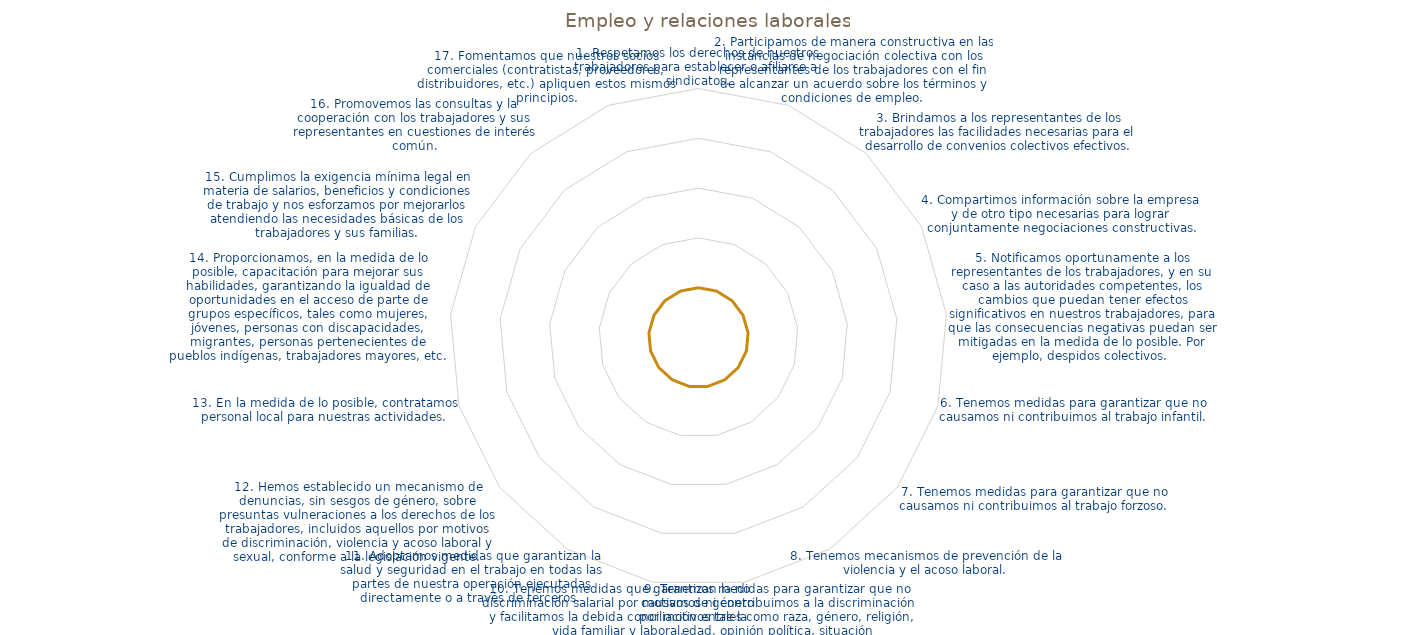
| Category | Series 0 |
|---|---|
| 1. Respetamos los derechos de nuestros trabajadores para establecer o afiliarse a sindicatos. | 1 |
| 2. Participamos de manera constructiva en las instancias de negociación colectiva con los representantes de los trabajadores con el fin de alcanzar un acuerdo sobre los términos y condiciones de empleo.  | 1 |
| 3. Brindamos a los representantes de los trabajadores las facilidades necesarias para el desarrollo de convenios colectivos efectivos. | 1 |
| 4. Compartimos información sobre la empresa y de otro tipo necesarias para lograr conjuntamente negociaciones constructivas. | 1 |
| 5. Notificamos oportunamente a los representantes de los trabajadores, y en su caso a las autoridades competentes, los cambios que puedan tener efectos significativos en nuestros trabajadores, para que las consecuencias negativas puedan ser mitigadas en la | 1 |
| 6. Tenemos medidas para garantizar que no causamos ni contribuimos al trabajo infantil. | 1 |
| 7. Tenemos medidas para garantizar que no causamos ni contribuimos al trabajo forzoso. | 1 |
| 8. Tenemos mecanismos de prevención de la violencia y el acoso laboral. | 1 |
| 9. Tenemos medidas para garantizar que no causamos ni contribuimos a la discriminación por motivos tales como raza, género, religión, edad, opinión política, situación socioeconómica, orientación sexual, identidad de género, entre otros. | 1 |
| 10. Tenemos medidas que garantizan la no discriminación salarial por motivos de género y facilitamos la debida conciliación entre la vida familiar y laboral. | 1 |
| 11. Adoptamos medidas que garantizan la salud y seguridad en el trabajo en todas las partes de nuestra operación ejecutadas directamente o a través de terceros.  | 1 |
| 12. Hemos establecido un mecanismo de denuncias, sin sesgos de género, sobre presuntas vulneraciones a los derechos de los trabajadores, incluidos aquellos por motivos de discriminación, violencia y acoso laboral y sexual, conforme a la legislación vigente | 1 |
| 13. En la medida de lo posible, contratamos personal local para nuestras actividades. | 1 |
| 14. Proporcionamos, en la medida de lo posible, capacitación para mejorar sus habilidades, garantizando la igualdad de oportunidades en el acceso de parte de grupos específicos, tales como mujeres, jóvenes, personas con discapacidades, migrantes, personas  | 1 |
| 15. Cumplimos la exigencia mínima legal en materia de salarios, beneficios y condiciones de trabajo y nos esforzamos por mejorarlos atendiendo las necesidades básicas de los trabajadores y sus familias. | 1 |
| 16. Promovemos las consultas y la cooperación con los trabajadores y sus representantes en cuestiones de interés común. | 1 |
| 17. Fomentamos que nuestros socios comerciales (contratistas, proveedores, distribuidores, etc.) apliquen estos mismos principios. | 1 |